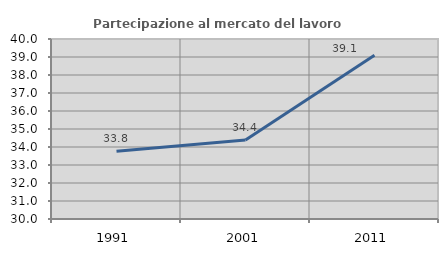
| Category | Partecipazione al mercato del lavoro  femminile |
|---|---|
| 1991.0 | 33.765 |
| 2001.0 | 34.391 |
| 2011.0 | 39.103 |